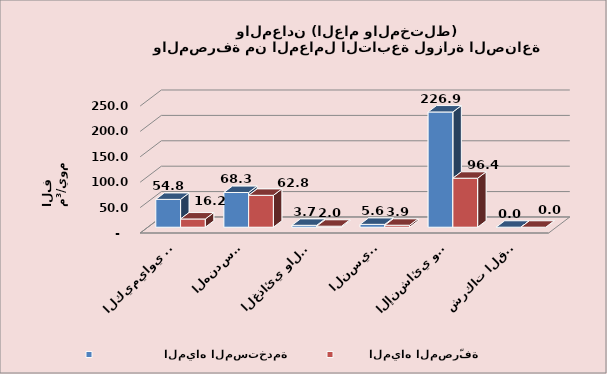
| Category |                  المياه المستخدمة                   |         المياه المصرّفة                   |
|---|---|---|
| الكيمياوي والبتروكيمياوي | 54.788 | 16.215 |
| الهندسي  | 68.346 | 62.811 |
| الغذائي والدوائي | 3.734 | 1.98 |
| النسيجي | 5.604 | 3.903 |
| الإنشائي والخدمات الصناعية | 226.887 | 96.444 |
| شركات القطاع المختلط | 0.036 | 0.026 |